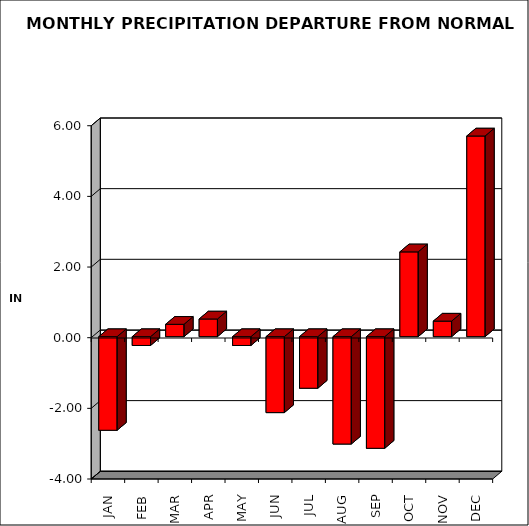
| Category | Series 0 |
|---|---|
| JAN | -2.65 |
| FEB | -0.25 |
| MAR | 0.35 |
| APR | 0.5 |
| MAY | -0.25 |
| JUN | -2.15 |
| JUL | -1.46 |
| AUG | -3.04 |
| SEP | -3.16 |
| OCT | 2.4 |
| NOV | 0.44 |
| DEC | 5.68 |